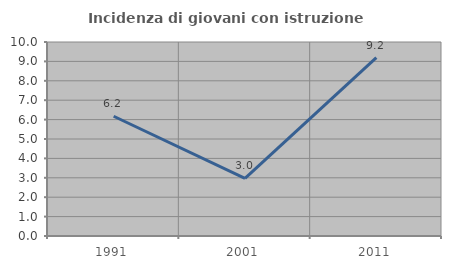
| Category | Incidenza di giovani con istruzione universitaria |
|---|---|
| 1991.0 | 6.173 |
| 2001.0 | 2.973 |
| 2011.0 | 9.192 |